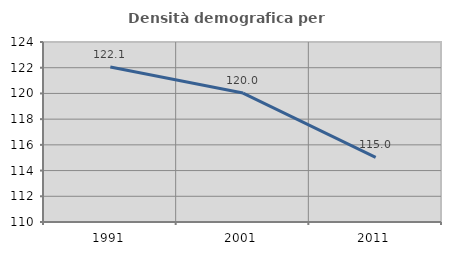
| Category | Densità demografica |
|---|---|
| 1991.0 | 122.052 |
| 2001.0 | 120.027 |
| 2011.0 | 115.034 |